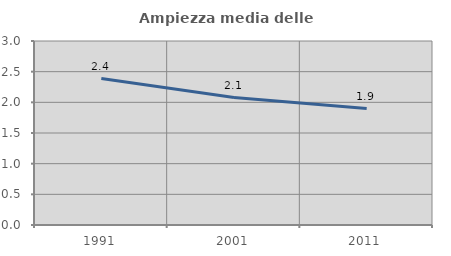
| Category | Ampiezza media delle famiglie |
|---|---|
| 1991.0 | 2.387 |
| 2001.0 | 2.078 |
| 2011.0 | 1.898 |